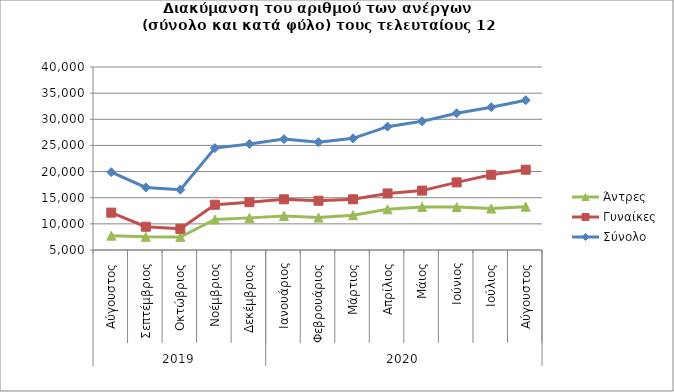
| Category | Άντρες | Γυναίκες | Σύνολο |
|---|---|---|---|
| 0 | 7739 | 12144 | 19883 |
| 1 | 7518 | 9450 | 16968 |
| 2 | 7491 | 9053 | 16544 |
| 3 | 10842 | 13653 | 24495 |
| 4 | 11144 | 14141 | 25285 |
| 5 | 11522 | 14692 | 26214 |
| 6 | 11203 | 14417 | 25620 |
| 7 | 11658 | 14695 | 26353 |
| 8 | 12774 | 15817 | 28591 |
| 9 | 13242 | 16362 | 29604 |
| 10 | 13223 | 17935 | 31158 |
| 11 | 12918 | 19395 | 32313 |
| 12 | 13294 | 20355 | 33649 |